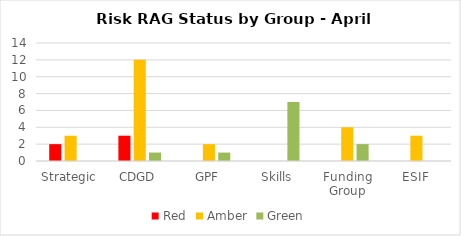
| Category | Red | Amber | Green |
|---|---|---|---|
| Strategic | 2 | 3 | 0 |
| CDGD | 3 | 12 | 1 |
| GPF | 0 | 2 | 1 |
| Skills | 0 | 0 | 7 |
| Funding Group | 0 | 4 | 2 |
| ESIF | 0 | 3 | 0 |